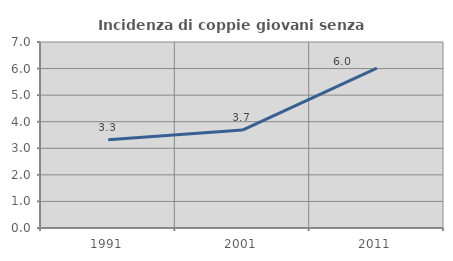
| Category | Incidenza di coppie giovani senza figli |
|---|---|
| 1991.0 | 3.321 |
| 2001.0 | 3.685 |
| 2011.0 | 6.019 |